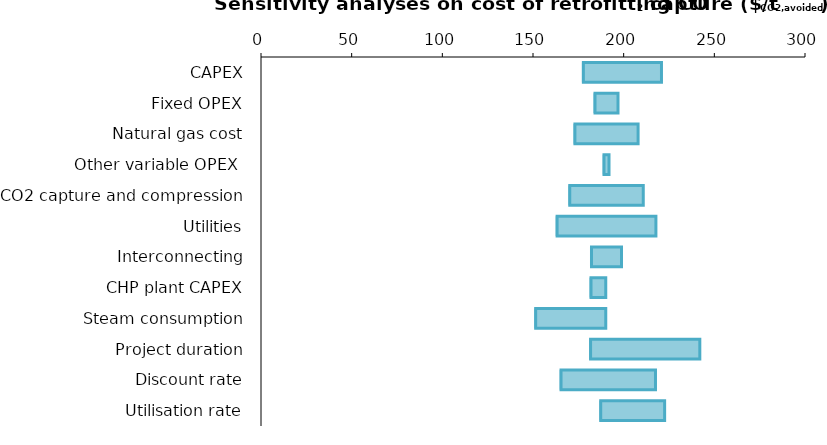
| Category | Minimum value | Increase of the parameter |
|---|---|---|
| CAPEX | 176.954 | 43.893 |
| Fixed OPEX | 183.308 | 13.629 |
| Natural gas cost | 172.289 | 35.667 |
| Other variable OPEX  | 188.358 | 3.528 |
| CO2 capture and compression | 169.438 | 41.368 |
| Utilities | 162.463 | 55.318 |
| Interconnecting | 181.428 | 17.388 |
| CHP plant CAPEX | 181.094 | 9.028 |
| Steam consumption | 150.641 | 39.481 |
| Project duration | 180.921 | 61.069 |
| Discount rate | 164.629 | 52.919 |
| Utilisation rate | 186.515 | 36.076 |